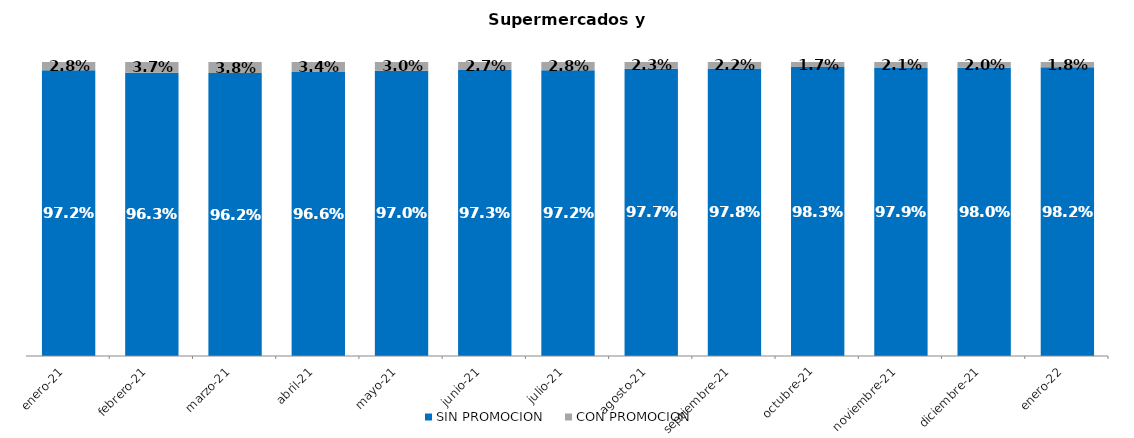
| Category | SIN PROMOCION   | CON PROMOCION   |
|---|---|---|
| 2021-01-01 | 0.972 | 0.028 |
| 2021-02-01 | 0.963 | 0.037 |
| 2021-03-01 | 0.962 | 0.038 |
| 2021-04-01 | 0.966 | 0.034 |
| 2021-05-01 | 0.97 | 0.03 |
| 2021-06-01 | 0.973 | 0.027 |
| 2021-07-01 | 0.972 | 0.028 |
| 2021-08-01 | 0.977 | 0.023 |
| 2021-09-01 | 0.978 | 0.022 |
| 2021-10-01 | 0.983 | 0.017 |
| 2021-11-01 | 0.979 | 0.021 |
| 2021-12-01 | 0.98 | 0.02 |
| 2022-01-01 | 0.982 | 0.018 |